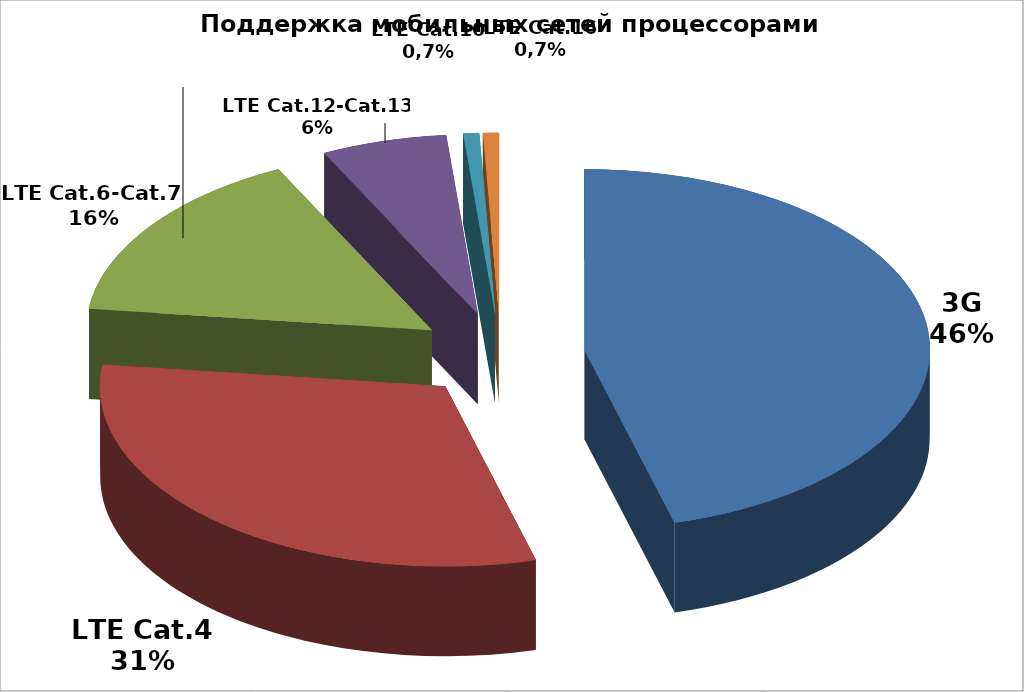
| Category | Series 0 |
|---|---|
| 3G | 125 |
| LTE Cat.4 | 85 |
| LTE Cat.6-Cat.7 | 43 |
| LTE Cat.12-Cat.13 | 16 |
| LTE Cat.10 | 2 |
| LTE Cat.16 | 2 |